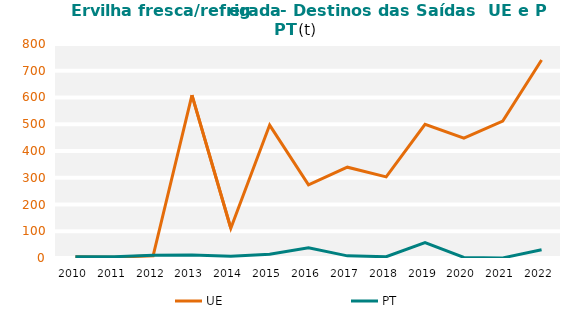
| Category | UE | PT |
|---|---|---|
| 2010.0 | 4.396 | 4.463 |
| 2011.0 | 2.899 | 4.691 |
| 2012.0 | 8.429 | 10.721 |
| 2013.0 | 608.767 | 11.079 |
| 2014.0 | 111.269 | 6.768 |
| 2015.0 | 496.899 | 13.81 |
| 2016.0 | 273.388 | 38.663 |
| 2017.0 | 339.546 | 8.035 |
| 2018.0 | 303.225 | 4.74 |
| 2019.0 | 499.991 | 57.606 |
| 2020.0 | 448.316 | 2.211 |
| 2021.0 | 511.893 | 0.439 |
| 2022.0 | 740.132 | 30.496 |